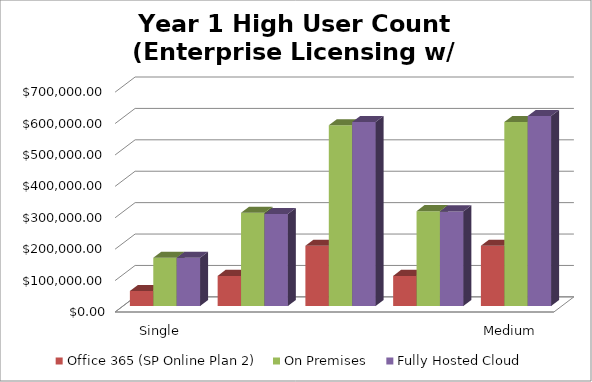
| Category | Office 365 (SP Online Plan 2)  | On Premises   | Fully Hosted Cloud   |
|---|---|---|---|
| Single Server Install (WFE and SQL on 1 VM) | 48000 | 153760.412 | 153540 |
| Small Farm - Two Server Install (WFE and SQL) | 96000 | 296982.444 | 292920 |
| Small Farm w/ High Availability (2 WFE - 2 SQL) | 192000 | 575594.125 | 585900 |
| Medium Farm (1 WFE, 1 App/Index, 1 SQL) | 96000 | 302112.403 | 301320 |
| Medium Farm w/ High Availability (2 WFE, 2 A/I, 2 SQL) | 192000 | 585943.177 | 604980 |